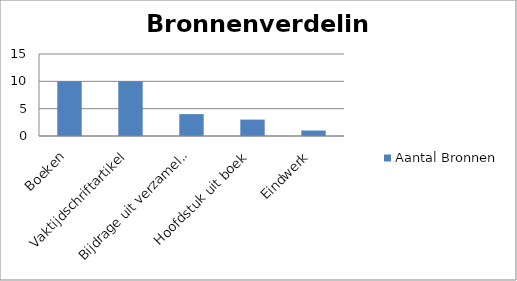
| Category | Aantal Bronnen |
|---|---|
| Boeken | 10 |
| Vaktijdschriftartikel | 10 |
| Bijdrage uit verzamelwerk | 4 |
| Hoofdstuk uit boek | 3 |
| Eindwerk | 1 |